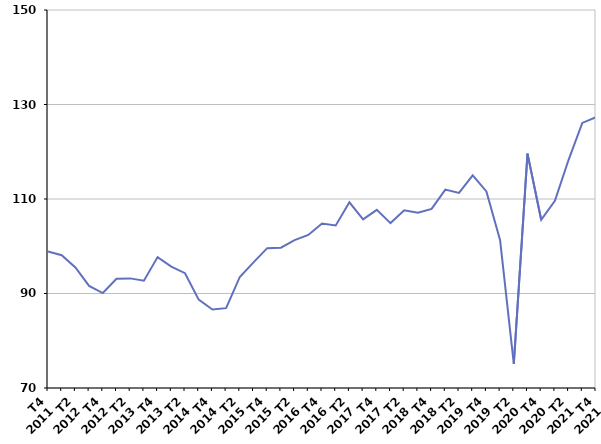
| Category | Reprise d'emploi déclarée |
|---|---|
| T4
2011 | 98.9 |
| T1
2012 | 98.1 |
| T2
2012 | 95.5 |
| T3
2012 | 91.6 |
| T4
2012 | 90.1 |
| T1
2013 | 93.1 |
| T2
2013 | 93.2 |
| T3
2013 | 92.7 |
| T4
2013 | 97.7 |
| T1
2014 | 95.7 |
| T2
2014 | 94.3 |
| T3
2014 | 88.7 |
| T4
2014 | 86.6 |
| T1
2015 | 86.9 |
| T2
2015 | 93.5 |
| T3
2015 | 96.6 |
| T4
2015 | 99.6 |
| T1
2016 | 99.7 |
| T2
2016 | 101.3 |
| T3
2016 | 102.4 |
| T4
2016 | 104.8 |
| T1
2017 | 104.4 |
| T2
2017 | 109.3 |
| T3
2017 | 105.7 |
| T4
2017 | 107.7 |
| T1
2018 | 104.9 |
| T2
2018 | 107.6 |
| T3
2018 | 107.1 |
| T4
2018 | 107.9 |
| T1
2019 | 112 |
| T2
2019 | 111.3 |
| T3
2019 | 115 |
| T4
2019 | 111.6 |
| T1
2020 | 101.3 |
| T2
2020 | 75.1 |
| T3
2020 | 119.6 |
| T4
2020 | 105.6 |
| T1
2021 | 109.6 |
| T2
2021 | 118.3 |
| T3
2021 | 126.1 |
| T4
2021 | 127.3 |